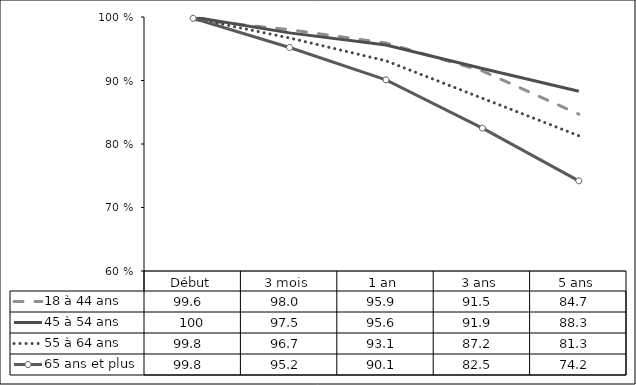
| Category | 18 à 44 ans | 45 à 54 ans | 55 à 64 ans | 65 ans et plus  |
|---|---|---|---|---|
| Début | 99.6 | 100 | 99.8 | 99.8 |
| 3 mois | 98 | 97.5 | 96.7 | 95.2 |
| 1 an | 95.9 | 95.6 | 93.1 | 90.1 |
| 3 ans | 91.5 | 91.9 | 87.2 | 82.5 |
| 5 ans | 84.7 | 88.3 | 81.3 | 74.2 |